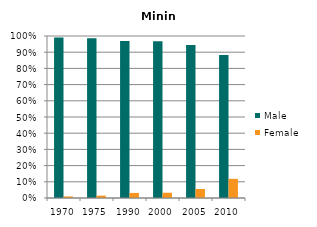
| Category | Male | Female |
|---|---|---|
| 1970.0 | 0.99 | 0.01 |
| 1975.0 | 0.985 | 0.015 |
| 1990.0 | 0.969 | 0.031 |
| 2000.0 | 0.968 | 0.032 |
| 2005.0 | 0.945 | 0.055 |
| 2010.0 | 0.882 | 0.118 |